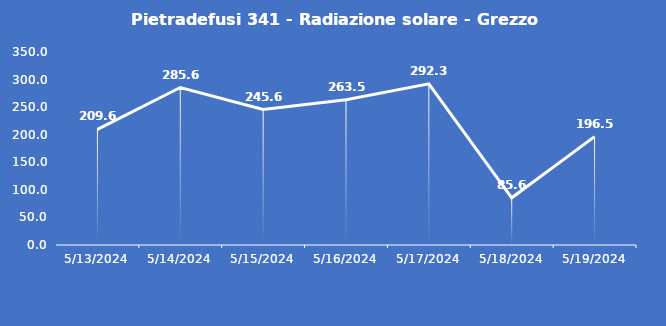
| Category | Pietradefusi 341 - Radiazione solare - Grezzo (W/m2) |
|---|---|
| 5/13/24 | 209.6 |
| 5/14/24 | 285.6 |
| 5/15/24 | 245.6 |
| 5/16/24 | 263.5 |
| 5/17/24 | 292.3 |
| 5/18/24 | 85.6 |
| 5/19/24 | 196.5 |